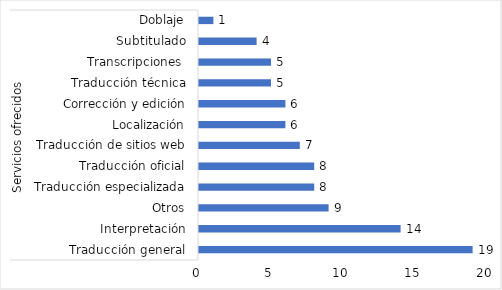
| Category | Series 0 |
|---|---|
| 0 | 19 |
| 1 | 14 |
| 2 | 9 |
| 3 | 8 |
| 4 | 8 |
| 5 | 7 |
| 6 | 6 |
| 7 | 6 |
| 8 | 5 |
| 9 | 5 |
| 10 | 4 |
| 11 | 1 |